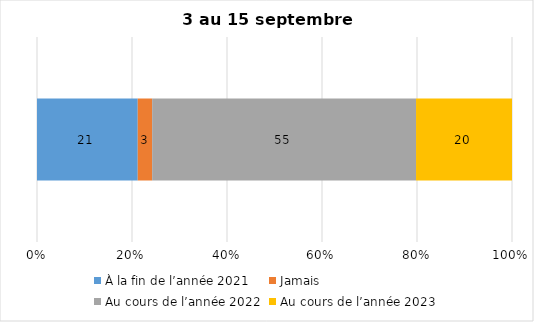
| Category | À la fin de l’année 2021 | Jamais | Au cours de l’année 2022 | Au cours de l’année 2023 |
|---|---|---|---|---|
| 0 | 21 | 3 | 55 | 20 |